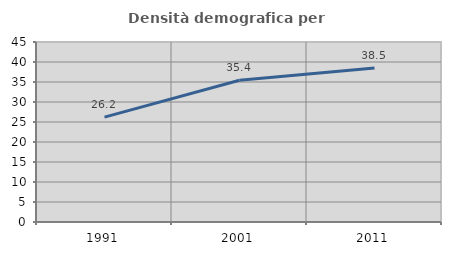
| Category | Densità demografica |
|---|---|
| 1991.0 | 26.221 |
| 2001.0 | 35.432 |
| 2011.0 | 38.528 |